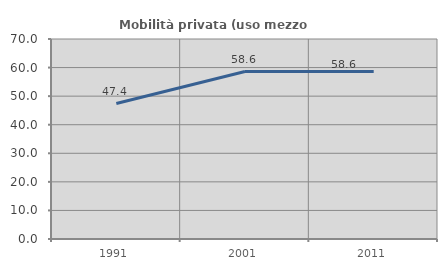
| Category | Mobilità privata (uso mezzo privato) |
|---|---|
| 1991.0 | 47.405 |
| 2001.0 | 58.608 |
| 2011.0 | 58.586 |